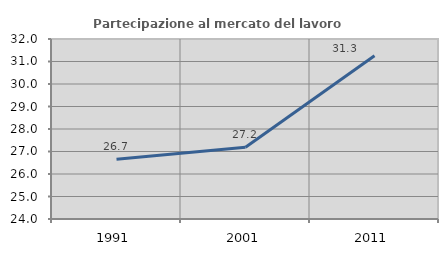
| Category | Partecipazione al mercato del lavoro  femminile |
|---|---|
| 1991.0 | 26.66 |
| 2001.0 | 27.186 |
| 2011.0 | 31.257 |